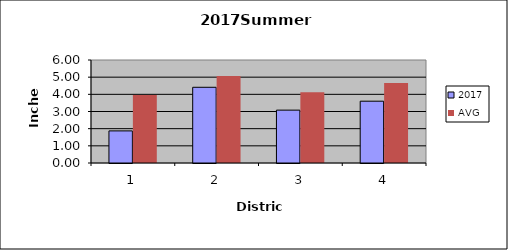
| Category | 2017 | AVG |
|---|---|---|
| 0 | 1.87 | 3.962 |
| 1 | 4.41 | 5.07 |
| 2 | 3.08 | 4.123 |
| 3 | 3.6 | 4.665 |